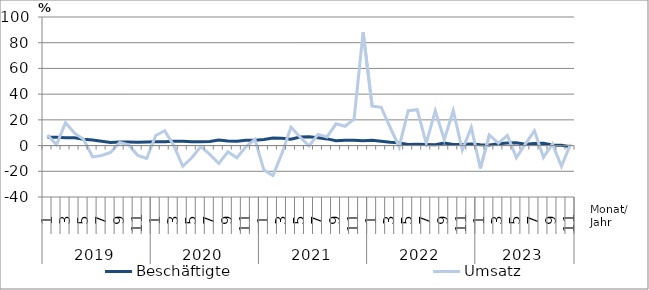
| Category | Beschäftigte | Umsatz |
|---|---|---|
| 0 | 6.4 | 8.2 |
| 1 | 6.5 | 0.6 |
| 2 | 6 | 17.8 |
| 3 | 6.1 | 9.6 |
| 4 | 4.9 | 4.9 |
| 5 | 4.3 | -8.8 |
| 6 | 3.3 | -7.7 |
| 7 | 2.4 | -5.4 |
| 8 | 2.8 | 2.4 |
| 9 | 2.7 | 0.5 |
| 10 | 2.5 | -7.6 |
| 11 | 2.7 | -10 |
| 12 | 2.9 | 7.8 |
| 13 | 2.9 | 11.5 |
| 14 | 3.4 | 0.1 |
| 15 | 3.4 | -16.1 |
| 16 | 2.9 | -9.5 |
| 17 | 2.9 | -0.8 |
| 18 | 3.1 | -6.9 |
| 19 | 4.3 | -14 |
| 20 | 3.6 | -4.9 |
| 21 | 3.4 | -9.4 |
| 22 | 4.1 | -0.9 |
| 23 | 4.1 | 4.9 |
| 24 | 4.8 | -19.1 |
| 25 | 5.8 | -23.3 |
| 26 | 5.6 | -6.1 |
| 27 | 5 | 14.4 |
| 28 | 6.6 | 6.6 |
| 29 | 6.9 | -0.3 |
| 30 | 6 | 8.7 |
| 31 | 5.2 | 6.7 |
| 32 | 3.8 | 16.9 |
| 33 | 4.2 | 15 |
| 34 | 4.2 | 20.6 |
| 35 | 3.7 | 88.1 |
| 36 | 4.1 | 30.7 |
| 37 | 3.4 | 29.8 |
| 38 | 2.6 | 14.1 |
| 39 | 2.1 | -1.1 |
| 40 | 0.9 | 27.1 |
| 41 | 1 | 27.9 |
| 42 | 0.8 | 1.7 |
| 43 | 0.7 | 27 |
| 44 | 2 | 4.7 |
| 45 | 0.9 | 27.1 |
| 46 | 0.9 | -3.5 |
| 47 | 1.2 | 14.1 |
| 48 | 0.6 | -17.8 |
| 49 | 0.5 | 8.2 |
| 50 | 1.4 | 1.9 |
| 51 | 2 | 7.9 |
| 52 | 2.2 | -9.4 |
| 53 | 1 | 1.3 |
| 54 | 1.6 | 11.5 |
| 55 | 1.8 | -9.2 |
| 56 | 0.4 | 1.2 |
| 57 | 0.2 | -16.1 |
| 58 | -0.9 | 1.2 |